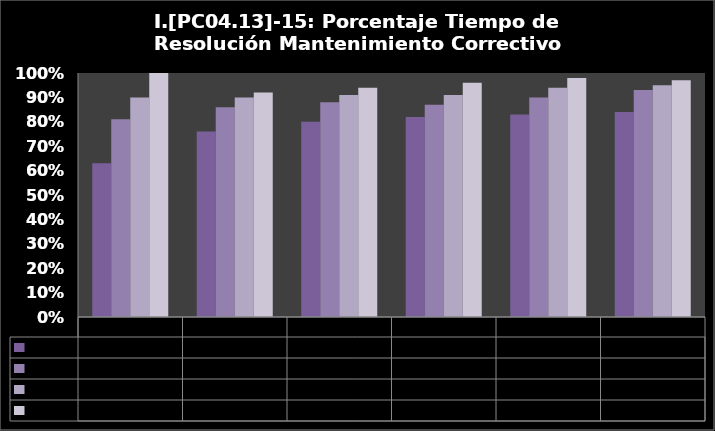
| Category | 2 Días | 5 Días | 10 Días | 20 Días |
|---|---|---|---|---|
| 2009.0 | 0.63 | 0.81 | 0.9 | 1 |
| 2010.0 | 0.76 | 0.86 | 0.9 | 0.92 |
| 2011.0 | 0.8 | 0.88 | 0.91 | 0.94 |
| 2012.0 | 0.82 | 0.87 | 0.91 | 0.96 |
| 2013.0 | 0.83 | 0.9 | 0.94 | 0.98 |
| 2014.0 | 0.84 | 0.93 | 0.95 | 0.97 |